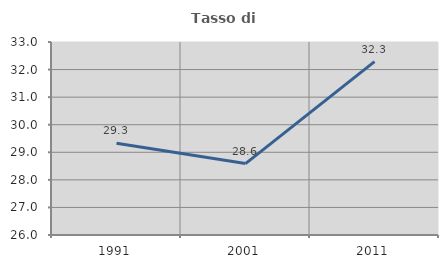
| Category | Tasso di occupazione   |
|---|---|
| 1991.0 | 29.329 |
| 2001.0 | 28.591 |
| 2011.0 | 32.286 |